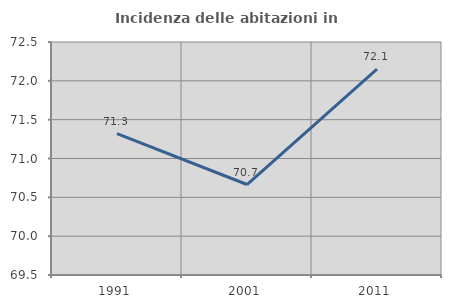
| Category | Incidenza delle abitazioni in proprietà  |
|---|---|
| 1991.0 | 71.322 |
| 2001.0 | 70.665 |
| 2011.0 | 72.15 |